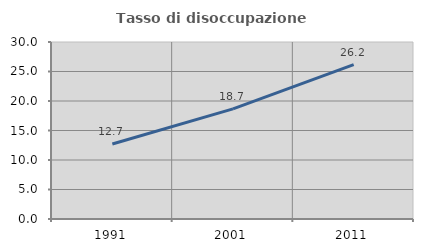
| Category | Tasso di disoccupazione giovanile  |
|---|---|
| 1991.0 | 12.712 |
| 2001.0 | 18.667 |
| 2011.0 | 26.168 |